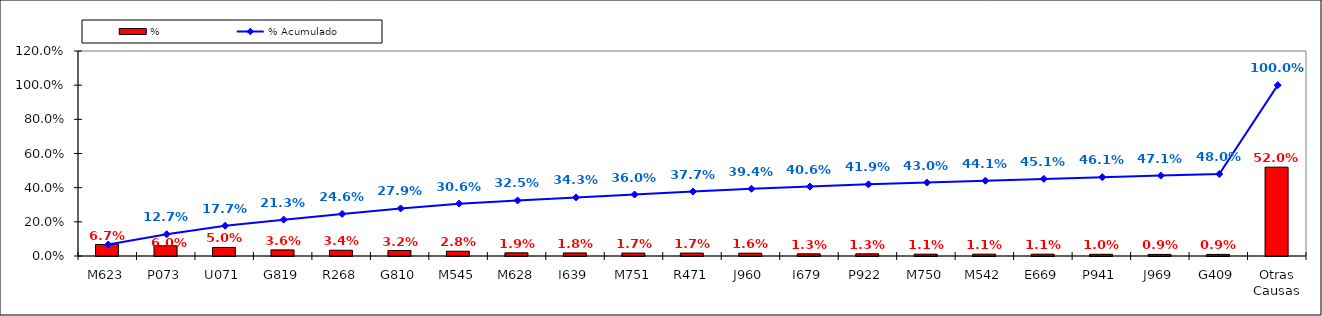
| Category | % |
|---|---|
| M623 | 0.067 |
| P073 | 0.06 |
| U071 | 0.05 |
| G819 | 0.036 |
| R268 | 0.034 |
| G810 | 0.032 |
| M545 | 0.028 |
| M628 | 0.019 |
| I639 | 0.018 |
| M751 | 0.017 |
| R471 | 0.017 |
| J960 | 0.016 |
| I679 | 0.013 |
| P922 | 0.013 |
| M750 | 0.011 |
| M542 | 0.011 |
| E669 | 0.011 |
| P941 | 0.01 |
| J969 | 0.009 |
| G409 | 0.009 |
| Otras Causas | 0.52 |